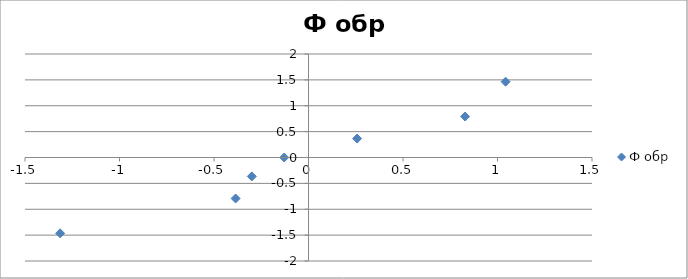
| Category | Ф обр |
|---|---|
| -1.314285714285715 | -1.465 |
| -0.385714285714287 | -0.792 |
| -0.3000000000000007 | -0.366 |
| -0.1285714285714299 | 0 |
| 0.25714285714285534 | 0.366 |
| 0.8285714285714274 | 0.792 |
| 1.042857142857141 | 1.465 |